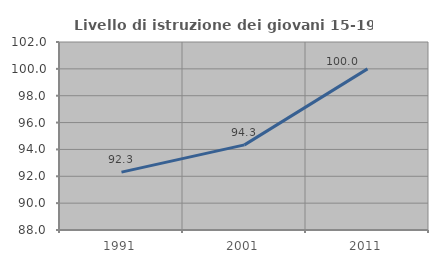
| Category | Livello di istruzione dei giovani 15-19 anni |
|---|---|
| 1991.0 | 92.308 |
| 2001.0 | 94.34 |
| 2011.0 | 100 |